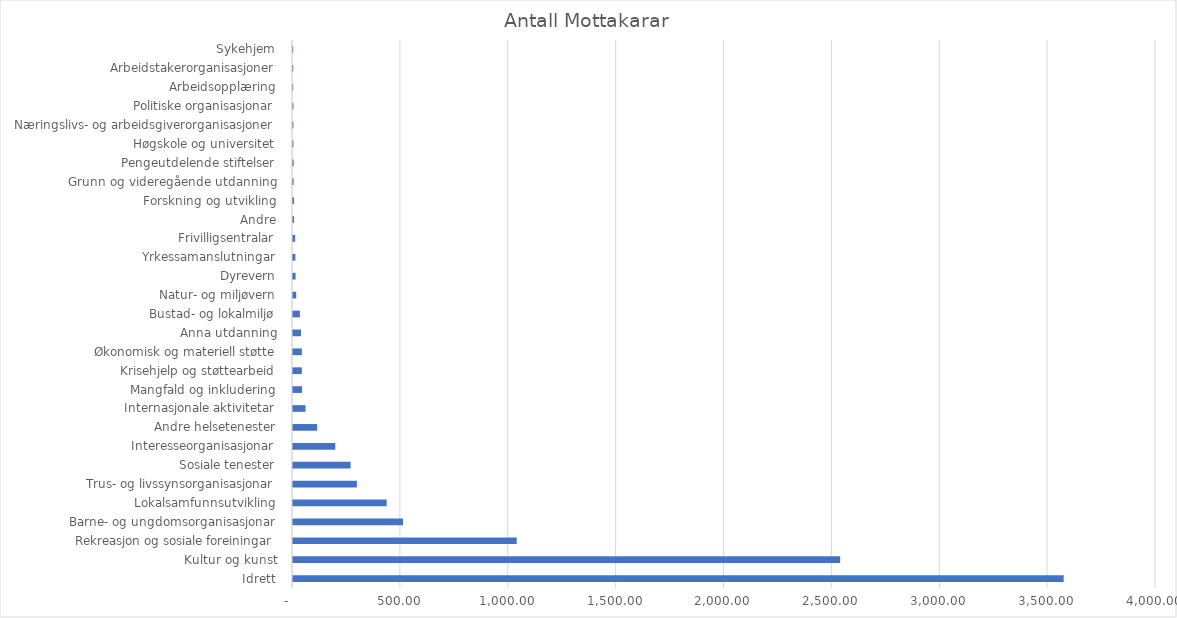
| Category | Antall Mottakarar |
|---|---|
|  Idrett  | 3572 |
|  Kultur og kunst  | 2536 |
|  Rekreasjon og sosiale foreiningar  | 1037 |
|  Barne- og ungdomsorganisasjonar  | 510 |
|  Lokalsamfunnsutvikling  | 434 |
|  Trus- og livssynsorganisasjonar  | 296 |
|  Sosiale tenester  | 267 |
|  Interesseorganisasjonar  | 196 |
|  Andre helsetenester  | 112 |
|  Internasjonale aktivitetar  | 58 |
|  Mangfald og inkludering  | 42 |
|  Krisehjelp og støttearbeid  | 41 |
|  Økonomisk og materiell støtte  | 41 |
|  Anna utdanning  | 37 |
|  Bustad- og lokalmiljø  | 32 |
|  Natur- og miljøvern  | 15 |
|  Dyrevern  | 12 |
|  Yrkessamanslutningar  | 11 |
|  Frivilligsentralar  | 10 |
|  Andre  | 5 |
|  Forskning og utvikling  | 5 |
|  Grunn og videregående utdanning  | 3 |
|  Pengeutdelende stiftelser  | 3 |
|  Høgskole og universitet  | 2 |
|  Næringslivs- og arbeidsgiverorganisasjoner  | 2 |
|  Politiske organisasjonar  | 2 |
|  Arbeidsopplæring  | 1 |
|  Arbeidstakerorganisasjoner  | 1 |
|  Sykehjem  | 1 |